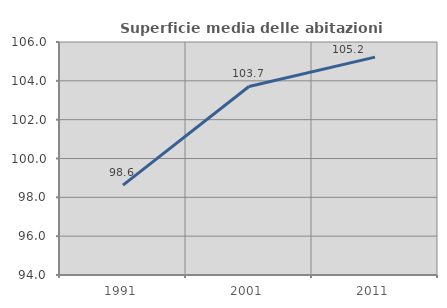
| Category | Superficie media delle abitazioni occupate |
|---|---|
| 1991.0 | 98.626 |
| 2001.0 | 103.709 |
| 2011.0 | 105.223 |